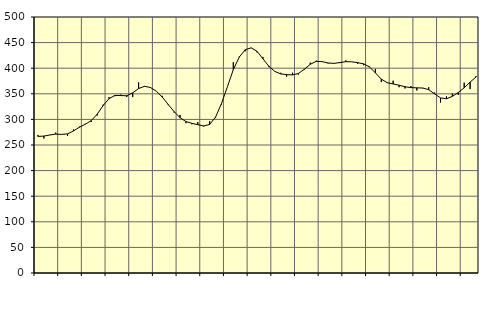
| Category | Piggar | Series 1 |
|---|---|---|
| nan | 269.5 | 266.78 |
| 1.0 | 262.8 | 267.42 |
| 1.0 | 269.8 | 269.55 |
| 1.0 | 274.3 | 271.25 |
| nan | 270.4 | 270.71 |
| 2.0 | 267.5 | 271.68 |
| 2.0 | 280.4 | 277.41 |
| 2.0 | 285.9 | 284.68 |
| nan | 291.4 | 290.55 |
| 3.0 | 294.9 | 297.56 |
| 3.0 | 307.5 | 310.14 |
| 3.0 | 328.8 | 326.82 |
| nan | 343.5 | 340.56 |
| 4.0 | 345.3 | 346.85 |
| 4.0 | 348.6 | 346.57 |
| 4.0 | 343.7 | 346.14 |
| nan | 343.6 | 351.82 |
| 5.0 | 372.2 | 360.26 |
| 5.0 | 364.1 | 364.64 |
| 5.0 | 361.4 | 362.33 |
| nan | 354.9 | 354.96 |
| 6.0 | 346 | 343.56 |
| 6.0 | 328 | 329.16 |
| 6.0 | 313.3 | 315.14 |
| nan | 308.7 | 303.35 |
| 7.0 | 292.7 | 295.8 |
| 7.0 | 290.5 | 292.33 |
| 7.0 | 294.7 | 289.65 |
| nan | 286.2 | 287.25 |
| 8.0 | 296.4 | 290.03 |
| 8.0 | 303.2 | 304.44 |
| 8.0 | 329.2 | 330.92 |
| nan | 363.7 | 363.66 |
| 9.0 | 411.8 | 397.23 |
| 9.0 | 422.6 | 421.59 |
| 9.0 | 433 | 435.95 |
| nan | 439.4 | 439.78 |
| 10.0 | 431 | 432.9 |
| 10.0 | 422 | 418.53 |
| 10.0 | 402.2 | 403.74 |
| nan | 393.5 | 393.75 |
| 11.0 | 391 | 388.88 |
| 11.0 | 383.4 | 387.4 |
| 11.0 | 391.2 | 386.91 |
| nan | 387.6 | 389.8 |
| 12.0 | 396.9 | 397.97 |
| 12.0 | 410.8 | 407.58 |
| 12.0 | 414.6 | 413.34 |
| nan | 412.9 | 412.8 |
| 13.0 | 409.5 | 410.16 |
| 13.0 | 409.1 | 409.44 |
| 13.0 | 410 | 411.03 |
| nan | 415.2 | 412.74 |
| 14.0 | 412.6 | 412.51 |
| 14.0 | 408.6 | 410.79 |
| 14.0 | 405.8 | 408.58 |
| nan | 403.2 | 402.59 |
| 15.0 | 398.6 | 390.92 |
| 15.0 | 372.9 | 378.63 |
| 15.0 | 371 | 371.7 |
| nan | 375.6 | 369.22 |
| 16.0 | 362.9 | 366.78 |
| 16.0 | 360.5 | 363.83 |
| 16.0 | 365.1 | 362.09 |
| nan | 356.5 | 361.61 |
| 17.0 | 360.9 | 361.32 |
| 17.0 | 362.7 | 358.11 |
| 17.0 | 352.3 | 349.81 |
| nan | 332.9 | 341.95 |
| 18.0 | 345.1 | 340.28 |
| 18.0 | 350.5 | 344.93 |
| 18.0 | 348.1 | 352.53 |
| nan | 371.6 | 361.71 |
| 19.0 | 359.2 | 372.91 |
| 19.0 | 384.6 | 382.83 |